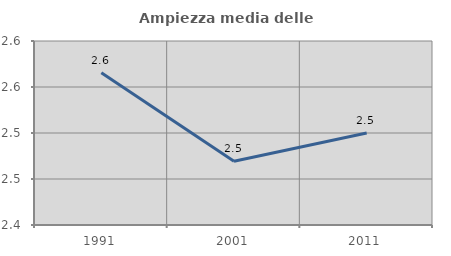
| Category | Ampiezza media delle famiglie |
|---|---|
| 1991.0 | 2.565 |
| 2001.0 | 2.469 |
| 2011.0 | 2.5 |